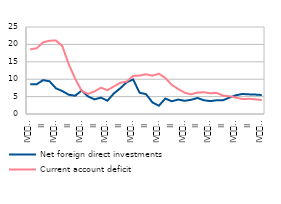
| Category | Net foreign direct investments | Current account deficit |
|---|---|---|
| IV
2007 | 8.579 | 18.572 |
| I | 8.54 | 18.885 |
| II | 9.741 | 20.588 |
| III | 9.401 | 21.062 |
| IV
2008 | 7.368 | 21.124 |
| I | 6.59 | 19.474 |
| II | 5.526 | 14.26 |
| III | 5.252 | 10.109 |
| IV
2009 | 6.745 | 6.628 |
| I | 5.037 | 5.786 |
| II | 4.2 | 6.507 |
| III | 4.719 | 7.555 |
| IV
2010 | 3.81 | 6.847 |
| I | 5.902 | 7.905 |
| II | 7.389 | 8.968 |
| III | 9.126 | 9.34 |
| IV
2011 | 9.926 | 10.932 |
| I | 6.12 | 11.044 |
| II | 5.711 | 11.398 |
| III | 3.326 | 11.005 |
| IV
2012 | 2.377 | 11.592 |
| I | 4.441 | 10.353 |
| II | 3.661 | 8.377 |
| III | 4.148 | 7.196 |
| IV
2013 | 3.789 | 6.125 |
| I | 4.077 | 5.65 |
| II | 4.605 | 6.167 |
| III | 3.945 | 6.233 |
| IV
2014 | 3.711 | 5.957 |
| I | 3.954 | 6.062 |
| II | 3.971 | 5.266 |
| III | 4.741 | 5.101 |
| IV
2015 | 5.385 | 4.709 |
| I | 5.757 | 4.278 |
| II | 5.642 | 4.363 |
| III | 5.578 | 4.206 |
| IV
2016 | 5.455 | 4.017 |